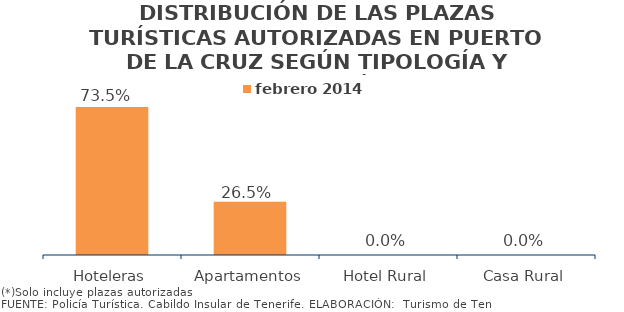
| Category | febrero 2014 |
|---|---|
| Hoteleras | 0.735 |
| Apartamentos | 0.265 |
| Hotel Rural | 0 |
| Casa Rural | 0 |